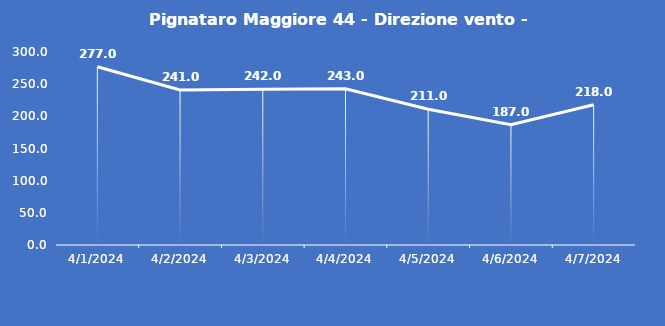
| Category | Pignataro Maggiore 44 - Direzione vento - Grezzo (°N) |
|---|---|
| 4/1/24 | 277 |
| 4/2/24 | 241 |
| 4/3/24 | 242 |
| 4/4/24 | 243 |
| 4/5/24 | 211 |
| 4/6/24 | 187 |
| 4/7/24 | 218 |